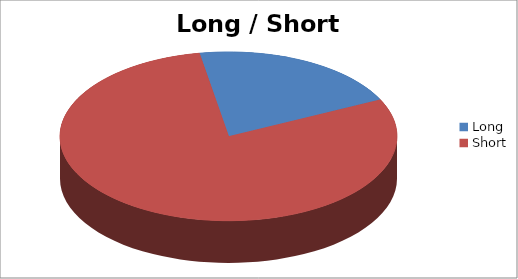
| Category | Series 1 |
|---|---|
| Long | 7 |
| Short | 27 |